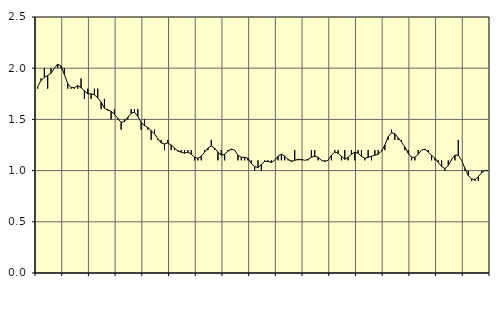
| Category | Piggar | Jordbruk, skogsbruk o fiske, SNI 01-03 |
|---|---|---|
| nan | 1.8 | 1.82 |
| 87.0 | 1.9 | 1.88 |
| 87.0 | 2 | 1.91 |
| 87.0 | 1.8 | 1.93 |
| nan | 2 | 1.95 |
| 88.0 | 2 | 2 |
| 88.0 | 2 | 2.04 |
| 88.0 | 2 | 2.02 |
| nan | 2 | 1.94 |
| 89.0 | 1.8 | 1.85 |
| 89.0 | 1.8 | 1.81 |
| 89.0 | 1.8 | 1.81 |
| nan | 1.8 | 1.83 |
| 90.0 | 1.9 | 1.81 |
| 90.0 | 1.7 | 1.78 |
| 90.0 | 1.8 | 1.75 |
| nan | 1.7 | 1.75 |
| 91.0 | 1.8 | 1.74 |
| 91.0 | 1.8 | 1.71 |
| 91.0 | 1.6 | 1.67 |
| nan | 1.7 | 1.61 |
| 92.0 | 1.6 | 1.59 |
| 92.0 | 1.5 | 1.58 |
| 92.0 | 1.6 | 1.55 |
| nan | 1.5 | 1.51 |
| 93.0 | 1.4 | 1.47 |
| 93.0 | 1.5 | 1.48 |
| 93.0 | 1.5 | 1.52 |
| nan | 1.6 | 1.56 |
| 94.0 | 1.6 | 1.57 |
| 94.0 | 1.6 | 1.53 |
| 94.0 | 1.4 | 1.47 |
| nan | 1.5 | 1.44 |
| 95.0 | 1.4 | 1.42 |
| 95.0 | 1.3 | 1.39 |
| 95.0 | 1.4 | 1.36 |
| nan | 1.3 | 1.31 |
| 96.0 | 1.3 | 1.27 |
| 96.0 | 1.2 | 1.26 |
| 96.0 | 1.3 | 1.27 |
| nan | 1.2 | 1.25 |
| 97.0 | 1.2 | 1.22 |
| 97.0 | 1.2 | 1.19 |
| 97.0 | 1.2 | 1.18 |
| nan | 1.2 | 1.17 |
| 98.0 | 1.2 | 1.18 |
| 98.0 | 1.2 | 1.16 |
| 98.0 | 1.1 | 1.13 |
| nan | 1.1 | 1.12 |
| 99.0 | 1.1 | 1.14 |
| 99.0 | 1.2 | 1.18 |
| 99.0 | 1.2 | 1.22 |
| nan | 1.3 | 1.24 |
| 0.0 | 1.2 | 1.22 |
| 0.0 | 1.1 | 1.18 |
| 0.0 | 1.2 | 1.15 |
| nan | 1.1 | 1.16 |
| 1.0 | 1.2 | 1.19 |
| 1.0 | 1.2 | 1.21 |
| 1.0 | 1.2 | 1.2 |
| nan | 1.1 | 1.15 |
| 2.0 | 1.1 | 1.13 |
| 2.0 | 1.1 | 1.13 |
| 2.0 | 1.1 | 1.12 |
| nan | 1.1 | 1.07 |
| 3.0 | 1 | 1.04 |
| 3.0 | 1.1 | 1.03 |
| 3.0 | 1 | 1.06 |
| nan | 1.1 | 1.09 |
| 4.0 | 1.1 | 1.09 |
| 4.0 | 1.1 | 1.08 |
| 4.0 | 1.1 | 1.1 |
| nan | 1.1 | 1.14 |
| 5.0 | 1.1 | 1.16 |
| 5.0 | 1.1 | 1.14 |
| 5.0 | 1.1 | 1.11 |
| nan | 1.1 | 1.09 |
| 6.0 | 1.2 | 1.1 |
| 6.0 | 1.1 | 1.11 |
| 6.0 | 1.1 | 1.11 |
| nan | 1.1 | 1.1 |
| 7.0 | 1.1 | 1.11 |
| 7.0 | 1.2 | 1.13 |
| 7.0 | 1.2 | 1.14 |
| nan | 1.1 | 1.13 |
| 8.0 | 1.1 | 1.1 |
| 8.0 | 1.1 | 1.09 |
| 8.0 | 1.1 | 1.1 |
| nan | 1.1 | 1.15 |
| 9.0 | 1.2 | 1.18 |
| 9.0 | 1.2 | 1.17 |
| 9.0 | 1.1 | 1.14 |
| nan | 1.2 | 1.11 |
| 10.0 | 1.1 | 1.13 |
| 10.0 | 1.2 | 1.16 |
| 10.0 | 1.1 | 1.18 |
| nan | 1.2 | 1.17 |
| 11.0 | 1.2 | 1.14 |
| 11.0 | 1.1 | 1.12 |
| 11.0 | 1.2 | 1.13 |
| nan | 1.1 | 1.14 |
| 12.0 | 1.2 | 1.15 |
| 12.0 | 1.2 | 1.16 |
| 12.0 | 1.2 | 1.19 |
| nan | 1.2 | 1.25 |
| 13.0 | 1.3 | 1.33 |
| 13.0 | 1.4 | 1.37 |
| 13.0 | 1.3 | 1.36 |
| nan | 1.3 | 1.32 |
| 14.0 | 1.3 | 1.28 |
| 14.0 | 1.2 | 1.23 |
| 14.0 | 1.2 | 1.17 |
| nan | 1.1 | 1.13 |
| 15.0 | 1.1 | 1.13 |
| 15.0 | 1.2 | 1.16 |
| 15.0 | 1.2 | 1.2 |
| nan | 1.2 | 1.21 |
| 16.0 | 1.2 | 1.18 |
| 16.0 | 1.1 | 1.15 |
| 16.0 | 1.1 | 1.12 |
| nan | 1.1 | 1.08 |
| 17.0 | 1.1 | 1.04 |
| 17.0 | 1 | 1.02 |
| 17.0 | 1.1 | 1.05 |
| nan | 1.1 | 1.11 |
| 18.0 | 1.1 | 1.15 |
| 18.0 | 1.3 | 1.15 |
| 18.0 | 1.1 | 1.1 |
| nan | 1 | 1.02 |
| 19.0 | 1 | 0.95 |
| 19.0 | 0.9 | 0.92 |
| 19.0 | 0.9 | 0.91 |
| nan | 0.9 | 0.94 |
| 20.0 | 1 | 0.98 |
| 20.0 | 1 | 1 |
| 20.0 | 1 | 1 |